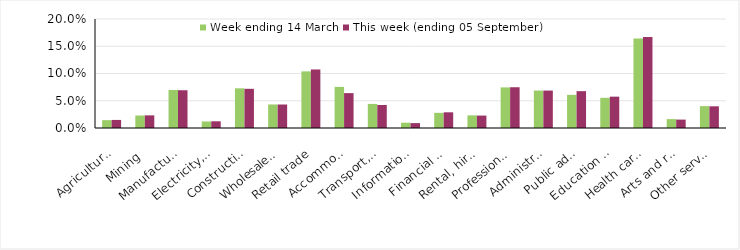
| Category | Week ending 14 March | This week (ending 05 September) |
|---|---|---|
| Agriculture, forestry and fishing | 0.014 | 0.015 |
| Mining | 0.023 | 0.023 |
| Manufacturing | 0.07 | 0.069 |
| Electricity, gas, water and waste services | 0.012 | 0.012 |
| Construction | 0.073 | 0.072 |
| Wholesale trade | 0.043 | 0.043 |
| Retail trade | 0.104 | 0.107 |
| Accommodation and food services | 0.075 | 0.064 |
| Transport, postal and warehousing | 0.044 | 0.042 |
| Information media and telecommunications | 0.01 | 0.009 |
| Financial and insurance services | 0.028 | 0.029 |
| Rental, hiring and real estate services | 0.023 | 0.023 |
| Professional, scientific and technical services | 0.074 | 0.075 |
| Administrative and support services | 0.069 | 0.069 |
| Public administration and safety | 0.061 | 0.068 |
| Education and training | 0.055 | 0.058 |
| Health care and social assistance | 0.164 | 0.167 |
| Arts and recreation services | 0.016 | 0.015 |
| Other services | 0.04 | 0.04 |